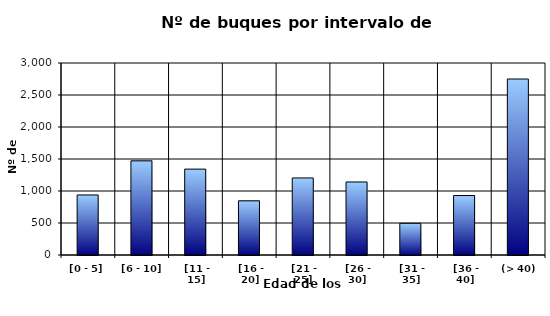
| Category | [0 - 5] |
|---|---|
| [0 - 5] | 938 |
|  [6 - 10] | 1471 |
|  [11 - 15] | 1342 |
|  [16 - 20] | 846 |
|  [21 - 25] | 1204 |
|  [26 - 30] | 1141 |
|  [31 - 35] | 495 |
|  [36 - 40] | 929 |
|  (> 40) | 2750 |